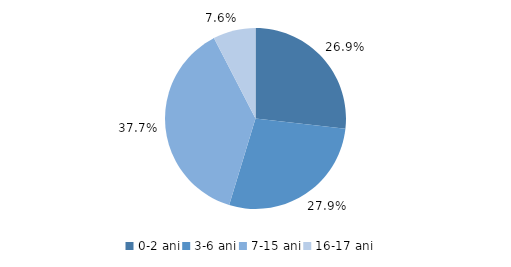
| Category | Series 0 |
|---|---|
| 0-2 ani | 26.8 |
| 3-6 ani | 27.9 |
| 7-15 ani | 37.7 |
| 16-17 ani | 7.6 |